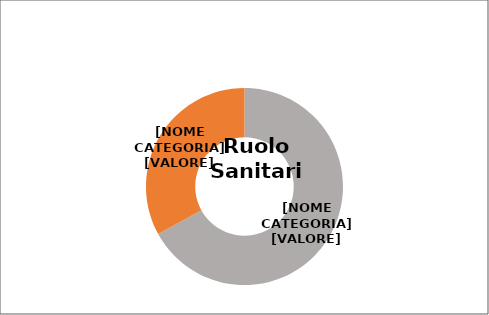
| Category | Series 0 |
|---|---|
| Donne  | 0.67 |
| Uomini  | 0.33 |